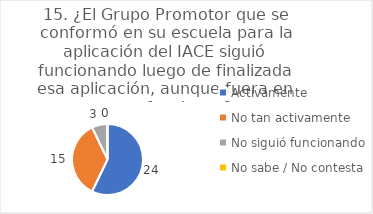
| Category | 15. ¿El Grupo Promotor que se conformó en su escuela para la aplicación del IACE siguió funcionando luego de finalizada esa aplicación, aunque fuera en otras funciones? |
|---|---|
| Activamente  | 0.571 |
| No tan activamente  | 0.357 |
| No siguió funcionando  | 0.071 |
| No sabe / No contesta | 0 |